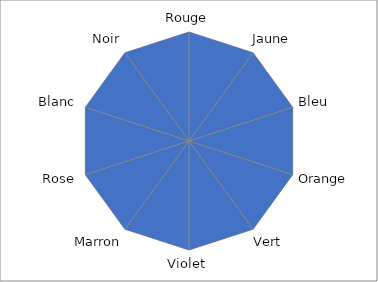
| Category | Series 0 |
|---|---|
| Rouge | 0 |
| Jaune | 0 |
| Bleu | 0 |
| Orange | 0 |
| Vert | 0 |
| Violet | 0 |
| Marron | 0 |
| Rose | 0 |
| Blanc | 0 |
| Noir | 0 |